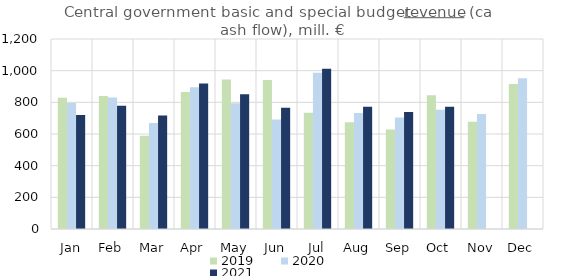
| Category | 2019 | 2020 | 2021 |
|---|---|---|---|
| Jan | 828428.225 | 795998.509 | 719936.476 |
| Feb | 840708.091 | 830472.811 | 778837.353 |
| Mar | 589539.492 | 669138.748 | 716345.153 |
| Apr | 865286.599 | 895800.773 | 918172.997 |
| May | 943563.097 | 794274.41 | 850408.995 |
| Jun | 940311.497 | 691853.749 | 766399.372 |
| Jul | 734286.934 | 986704.148 | 1012068.157 |
| Aug | 674213.841 | 732737.981 | 772337.686 |
| Sep | 627788.843 | 703975.648 | 738843.047 |
| Oct | 844974.841 | 753153.989 | 772680.373 |
| Nov | 676589.461 | 726987.913 | 0 |
| Dec | 915743.701 | 951540.526 | 0 |